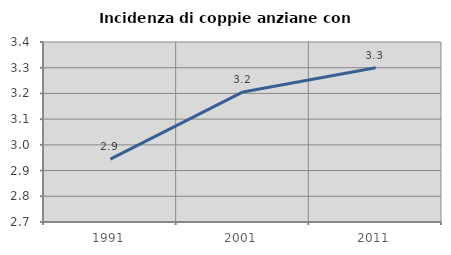
| Category | Incidenza di coppie anziane con figli |
|---|---|
| 1991.0 | 2.945 |
| 2001.0 | 3.206 |
| 2011.0 | 3.3 |